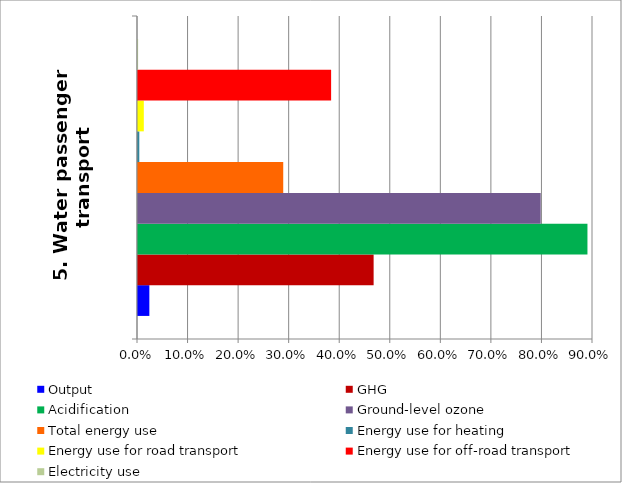
| Category | Output | GHG | Acidification | Ground-level ozone | Total energy use | Energy use for heating | Energy use for road transport | Energy use for off-road transport | Electricity use |
|---|---|---|---|---|---|---|---|---|---|
| 5. Water passenger transport | 0.022 | 0.466 | 0.889 | 0.797 | 0.287 | 0.003 | 0.011 | 0.382 | 0 |